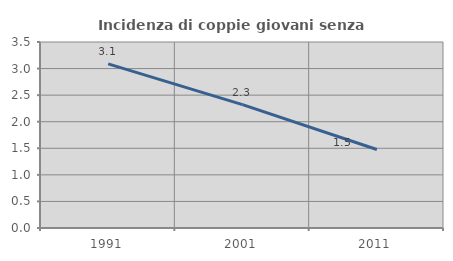
| Category | Incidenza di coppie giovani senza figli |
|---|---|
| 1991.0 | 3.089 |
| 2001.0 | 2.321 |
| 2011.0 | 1.477 |